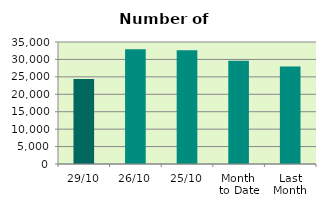
| Category | Series 0 |
|---|---|
| 29/10 | 24356 |
| 26/10 | 32954 |
| 25/10 | 32598 |
| Month 
to Date | 29586.476 |
| Last
Month | 27963.2 |